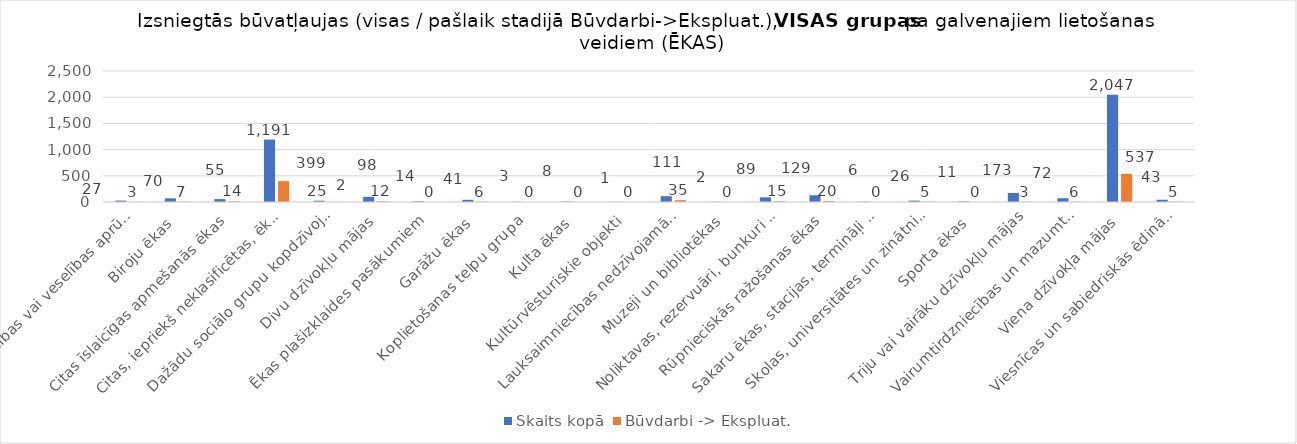
| Category | Skaits kopā | Būvdarbi -> Ekspluat. |
|---|---|---|
| Ārstniecības vai veselības aprūpes iestāžu ēkas | 27 | 3 |
| Biroju ēkas | 70 | 7 |
| Citas īslaicīgas apmešanās ēkas | 55 | 14 |
| Citas, iepriekš neklasificētas, ēkas | 1191 | 399 |
| Dažādu sociālo grupu kopdzīvojamās mājas | 25 | 2 |
| Divu dzīvokļu mājas | 98 | 12 |
| Ēkas plašizklaides pasākumiem | 14 | 0 |
| Garāžu ēkas | 41 | 6 |
| Koplietošanas telpu grupa | 3 | 0 |
| Kulta ēkas | 8 | 0 |
| Kultūrvēsturiskie objekti | 1 | 0 |
| Lauksaimniecības nedzīvojamās ēkas | 111 | 35 |
| Muzeji un bibliotēkas | 2 | 0 |
| Noliktavas, rezervuāri, bunkuri un silosi | 89 | 15 |
| Rūpnieciskās ražošanas ēkas | 129 | 20 |
| Sakaru ēkas, stacijas, termināļi un ar tiem saistītās ēkas | 6 | 0 |
| Skolas, universitātes un zinātniskajai pētniecībai paredzētās ēkas | 26 | 5 |
| Sporta ēkas | 11 | 0 |
| Triju vai vairāku dzīvokļu mājas | 173 | 3 |
| Vairumtirdzniecības un mazumtirdzniecības ēkas | 72 | 6 |
| Viena dzīvokļa mājas | 2047 | 537 |
| Viesnīcas un sabiedriskās ēdināšanas ēkas | 43 | 5 |